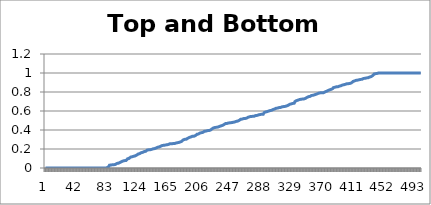
| Category | Top and Bottom Slice |
|---|---|
| 0 | 0 |
| 1 | 0 |
| 2 | 0 |
| 3 | 0 |
| 4 | 0 |
| 5 | 0 |
| 6 | 0 |
| 7 | 0 |
| 8 | 0 |
| 9 | 0 |
| 10 | 0 |
| 11 | 0 |
| 12 | 0 |
| 13 | 0 |
| 14 | 0 |
| 15 | 0 |
| 16 | 0 |
| 17 | 0 |
| 18 | 0 |
| 19 | 0 |
| 20 | 0 |
| 21 | 0 |
| 22 | 0 |
| 23 | 0 |
| 24 | 0 |
| 25 | 0 |
| 26 | 0 |
| 27 | 0 |
| 28 | 0 |
| 29 | 0 |
| 30 | 0 |
| 31 | 0 |
| 32 | 0 |
| 33 | 0 |
| 34 | 0 |
| 35 | 0 |
| 36 | 0 |
| 37 | 0 |
| 38 | 0 |
| 39 | 0 |
| 40 | 0 |
| 41 | 0 |
| 42 | 0 |
| 43 | 0 |
| 44 | 0 |
| 45 | 0 |
| 46 | 0 |
| 47 | 0 |
| 48 | 0 |
| 49 | 0 |
| 50 | 0 |
| 51 | 0 |
| 52 | 0 |
| 53 | 0 |
| 54 | 0 |
| 55 | 0 |
| 56 | 0 |
| 57 | 0 |
| 58 | 0 |
| 59 | 0 |
| 60 | 0 |
| 61 | 0 |
| 62 | 0 |
| 63 | 0 |
| 64 | 0 |
| 65 | 0 |
| 66 | 0 |
| 67 | 0 |
| 68 | 0 |
| 69 | 0 |
| 70 | 0 |
| 71 | 0 |
| 72 | 0 |
| 73 | 0 |
| 74 | 0 |
| 75 | 0 |
| 76 | 0 |
| 77 | 0 |
| 78 | 0 |
| 79 | 0 |
| 80 | 0 |
| 81 | 0 |
| 82 | 0.004 |
| 83 | 0.005 |
| 84 | 0.015 |
| 85 | 0.03 |
| 86 | 0.031 |
| 87 | 0.031 |
| 88 | 0.033 |
| 89 | 0.034 |
| 90 | 0.034 |
| 91 | 0.035 |
| 92 | 0.035 |
| 93 | 0.038 |
| 94 | 0.04 |
| 95 | 0.048 |
| 96 | 0.049 |
| 97 | 0.05 |
| 98 | 0.054 |
| 99 | 0.059 |
| 100 | 0.066 |
| 101 | 0.067 |
| 102 | 0.073 |
| 103 | 0.074 |
| 104 | 0.077 |
| 105 | 0.078 |
| 106 | 0.078 |
| 107 | 0.079 |
| 108 | 0.088 |
| 109 | 0.097 |
| 110 | 0.099 |
| 111 | 0.1 |
| 112 | 0.11 |
| 113 | 0.115 |
| 114 | 0.118 |
| 115 | 0.118 |
| 116 | 0.119 |
| 117 | 0.123 |
| 118 | 0.126 |
| 119 | 0.127 |
| 120 | 0.128 |
| 121 | 0.135 |
| 122 | 0.139 |
| 123 | 0.147 |
| 124 | 0.151 |
| 125 | 0.151 |
| 126 | 0.153 |
| 127 | 0.161 |
| 128 | 0.163 |
| 129 | 0.165 |
| 130 | 0.171 |
| 131 | 0.173 |
| 132 | 0.173 |
| 133 | 0.175 |
| 134 | 0.184 |
| 135 | 0.188 |
| 136 | 0.189 |
| 137 | 0.191 |
| 138 | 0.192 |
| 139 | 0.192 |
| 140 | 0.194 |
| 141 | 0.196 |
| 142 | 0.198 |
| 143 | 0.202 |
| 144 | 0.203 |
| 145 | 0.205 |
| 146 | 0.205 |
| 147 | 0.211 |
| 148 | 0.218 |
| 149 | 0.219 |
| 150 | 0.221 |
| 151 | 0.222 |
| 152 | 0.229 |
| 153 | 0.23 |
| 154 | 0.232 |
| 155 | 0.237 |
| 156 | 0.237 |
| 157 | 0.239 |
| 158 | 0.239 |
| 159 | 0.241 |
| 160 | 0.244 |
| 161 | 0.245 |
| 162 | 0.247 |
| 163 | 0.247 |
| 164 | 0.253 |
| 165 | 0.254 |
| 166 | 0.255 |
| 167 | 0.255 |
| 168 | 0.255 |
| 169 | 0.257 |
| 170 | 0.257 |
| 171 | 0.257 |
| 172 | 0.26 |
| 173 | 0.262 |
| 174 | 0.264 |
| 175 | 0.266 |
| 176 | 0.266 |
| 177 | 0.269 |
| 178 | 0.272 |
| 179 | 0.274 |
| 180 | 0.279 |
| 181 | 0.282 |
| 182 | 0.289 |
| 183 | 0.297 |
| 184 | 0.298 |
| 185 | 0.302 |
| 186 | 0.302 |
| 187 | 0.304 |
| 188 | 0.312 |
| 189 | 0.314 |
| 190 | 0.32 |
| 191 | 0.322 |
| 192 | 0.322 |
| 193 | 0.327 |
| 194 | 0.333 |
| 195 | 0.334 |
| 196 | 0.334 |
| 197 | 0.334 |
| 198 | 0.335 |
| 199 | 0.341 |
| 200 | 0.344 |
| 201 | 0.355 |
| 202 | 0.357 |
| 203 | 0.358 |
| 204 | 0.364 |
| 205 | 0.368 |
| 206 | 0.371 |
| 207 | 0.372 |
| 208 | 0.375 |
| 209 | 0.376 |
| 210 | 0.376 |
| 211 | 0.387 |
| 212 | 0.387 |
| 213 | 0.389 |
| 214 | 0.391 |
| 215 | 0.393 |
| 216 | 0.394 |
| 217 | 0.394 |
| 218 | 0.397 |
| 219 | 0.399 |
| 220 | 0.409 |
| 221 | 0.412 |
| 222 | 0.419 |
| 223 | 0.422 |
| 224 | 0.426 |
| 225 | 0.427 |
| 226 | 0.428 |
| 227 | 0.428 |
| 228 | 0.431 |
| 229 | 0.432 |
| 230 | 0.433 |
| 231 | 0.438 |
| 232 | 0.438 |
| 233 | 0.444 |
| 234 | 0.444 |
| 235 | 0.448 |
| 236 | 0.45 |
| 237 | 0.458 |
| 238 | 0.459 |
| 239 | 0.468 |
| 240 | 0.468 |
| 241 | 0.469 |
| 242 | 0.474 |
| 243 | 0.474 |
| 244 | 0.476 |
| 245 | 0.476 |
| 246 | 0.476 |
| 247 | 0.478 |
| 248 | 0.481 |
| 249 | 0.481 |
| 250 | 0.481 |
| 251 | 0.484 |
| 252 | 0.49 |
| 253 | 0.491 |
| 254 | 0.492 |
| 255 | 0.494 |
| 256 | 0.498 |
| 257 | 0.502 |
| 258 | 0.504 |
| 259 | 0.513 |
| 260 | 0.514 |
| 261 | 0.515 |
| 262 | 0.517 |
| 263 | 0.52 |
| 264 | 0.521 |
| 265 | 0.521 |
| 266 | 0.525 |
| 267 | 0.526 |
| 268 | 0.527 |
| 269 | 0.535 |
| 270 | 0.536 |
| 271 | 0.54 |
| 272 | 0.542 |
| 273 | 0.543 |
| 274 | 0.544 |
| 275 | 0.544 |
| 276 | 0.544 |
| 277 | 0.545 |
| 278 | 0.551 |
| 279 | 0.553 |
| 280 | 0.553 |
| 281 | 0.554 |
| 282 | 0.556 |
| 283 | 0.56 |
| 284 | 0.562 |
| 285 | 0.563 |
| 286 | 0.566 |
| 287 | 0.566 |
| 288 | 0.566 |
| 289 | 0.567 |
| 290 | 0.582 |
| 291 | 0.584 |
| 292 | 0.59 |
| 293 | 0.59 |
| 294 | 0.594 |
| 295 | 0.599 |
| 296 | 0.599 |
| 297 | 0.601 |
| 298 | 0.604 |
| 299 | 0.605 |
| 300 | 0.607 |
| 301 | 0.616 |
| 302 | 0.616 |
| 303 | 0.62 |
| 304 | 0.621 |
| 305 | 0.625 |
| 306 | 0.629 |
| 307 | 0.63 |
| 308 | 0.631 |
| 309 | 0.635 |
| 310 | 0.636 |
| 311 | 0.636 |
| 312 | 0.637 |
| 313 | 0.64 |
| 314 | 0.644 |
| 315 | 0.646 |
| 316 | 0.647 |
| 317 | 0.648 |
| 318 | 0.649 |
| 319 | 0.65 |
| 320 | 0.654 |
| 321 | 0.656 |
| 322 | 0.66 |
| 323 | 0.669 |
| 324 | 0.67 |
| 325 | 0.67 |
| 326 | 0.675 |
| 327 | 0.679 |
| 328 | 0.679 |
| 329 | 0.682 |
| 330 | 0.682 |
| 331 | 0.699 |
| 332 | 0.709 |
| 333 | 0.709 |
| 334 | 0.714 |
| 335 | 0.714 |
| 336 | 0.718 |
| 337 | 0.72 |
| 338 | 0.721 |
| 339 | 0.724 |
| 340 | 0.724 |
| 341 | 0.726 |
| 342 | 0.726 |
| 343 | 0.727 |
| 344 | 0.731 |
| 345 | 0.733 |
| 346 | 0.743 |
| 347 | 0.743 |
| 348 | 0.746 |
| 349 | 0.751 |
| 350 | 0.752 |
| 351 | 0.754 |
| 352 | 0.755 |
| 353 | 0.764 |
| 354 | 0.764 |
| 355 | 0.765 |
| 356 | 0.766 |
| 357 | 0.77 |
| 358 | 0.773 |
| 359 | 0.776 |
| 360 | 0.782 |
| 361 | 0.782 |
| 362 | 0.783 |
| 363 | 0.789 |
| 364 | 0.789 |
| 365 | 0.791 |
| 366 | 0.793 |
| 367 | 0.793 |
| 368 | 0.793 |
| 369 | 0.793 |
| 370 | 0.795 |
| 371 | 0.802 |
| 372 | 0.806 |
| 373 | 0.808 |
| 374 | 0.809 |
| 375 | 0.816 |
| 376 | 0.822 |
| 377 | 0.823 |
| 378 | 0.823 |
| 379 | 0.828 |
| 380 | 0.829 |
| 381 | 0.835 |
| 382 | 0.846 |
| 383 | 0.848 |
| 384 | 0.85 |
| 385 | 0.854 |
| 386 | 0.854 |
| 387 | 0.855 |
| 388 | 0.856 |
| 389 | 0.86 |
| 390 | 0.861 |
| 391 | 0.864 |
| 392 | 0.866 |
| 393 | 0.872 |
| 394 | 0.873 |
| 395 | 0.874 |
| 396 | 0.877 |
| 397 | 0.878 |
| 398 | 0.881 |
| 399 | 0.884 |
| 400 | 0.887 |
| 401 | 0.888 |
| 402 | 0.888 |
| 403 | 0.889 |
| 404 | 0.89 |
| 405 | 0.894 |
| 406 | 0.896 |
| 407 | 0.9 |
| 408 | 0.911 |
| 409 | 0.913 |
| 410 | 0.917 |
| 411 | 0.918 |
| 412 | 0.922 |
| 413 | 0.923 |
| 414 | 0.925 |
| 415 | 0.925 |
| 416 | 0.929 |
| 417 | 0.93 |
| 418 | 0.933 |
| 419 | 0.934 |
| 420 | 0.934 |
| 421 | 0.942 |
| 422 | 0.943 |
| 423 | 0.943 |
| 424 | 0.944 |
| 425 | 0.948 |
| 426 | 0.948 |
| 427 | 0.949 |
| 428 | 0.95 |
| 429 | 0.95 |
| 430 | 0.957 |
| 431 | 0.958 |
| 432 | 0.962 |
| 433 | 0.972 |
| 434 | 0.973 |
| 435 | 0.978 |
| 436 | 0.989 |
| 437 | 0.992 |
| 438 | 0.993 |
| 439 | 0.995 |
| 440 | 0.995 |
| 441 | 0.997 |
| 442 | 1 |
| 443 | 1 |
| 444 | 1 |
| 445 | 1 |
| 446 | 1 |
| 447 | 1 |
| 448 | 1 |
| 449 | 1 |
| 450 | 1 |
| 451 | 1 |
| 452 | 1 |
| 453 | 1 |
| 454 | 1 |
| 455 | 1 |
| 456 | 1 |
| 457 | 1 |
| 458 | 1 |
| 459 | 1 |
| 460 | 1 |
| 461 | 1 |
| 462 | 1 |
| 463 | 1 |
| 464 | 1 |
| 465 | 1 |
| 466 | 1 |
| 467 | 1 |
| 468 | 1 |
| 469 | 1 |
| 470 | 1 |
| 471 | 1 |
| 472 | 1 |
| 473 | 1 |
| 474 | 1 |
| 475 | 1 |
| 476 | 1 |
| 477 | 1 |
| 478 | 1 |
| 479 | 1 |
| 480 | 1 |
| 481 | 1 |
| 482 | 1 |
| 483 | 1 |
| 484 | 1 |
| 485 | 1 |
| 486 | 1 |
| 487 | 1 |
| 488 | 1 |
| 489 | 1 |
| 490 | 1 |
| 491 | 1 |
| 492 | 1 |
| 493 | 1 |
| 494 | 1 |
| 495 | 1 |
| 496 | 1 |
| 497 | 1 |
| 498 | 1 |
| 499 | 1 |